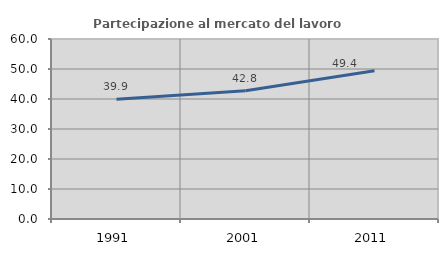
| Category | Partecipazione al mercato del lavoro  femminile |
|---|---|
| 1991.0 | 39.944 |
| 2001.0 | 42.766 |
| 2011.0 | 49.405 |